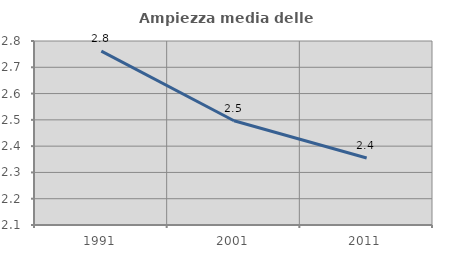
| Category | Ampiezza media delle famiglie |
|---|---|
| 1991.0 | 2.761 |
| 2001.0 | 2.497 |
| 2011.0 | 2.355 |